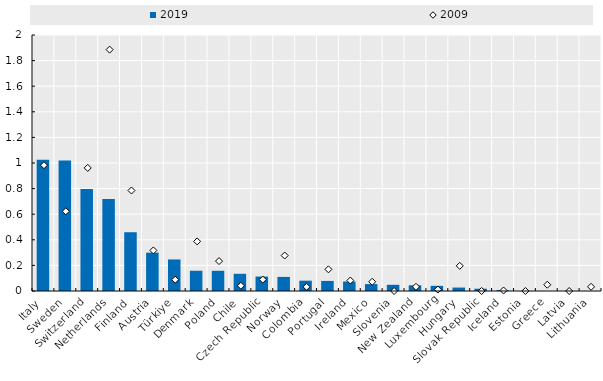
| Category | 2019 |
|---|---|
| Italy | 1.026 |
| Sweden | 1.019 |
| Switzerland | 0.797 |
| Netherlands | 0.719 |
| Finland | 0.459 |
| Austria | 0.3 |
| Türkiye | 0.246 |
| Denmark | 0.158 |
| Poland | 0.158 |
| Chile | 0.134 |
| Czech Republic | 0.113 |
| Norway | 0.11 |
| Colombia | 0.081 |
| Portugal | 0.079 |
| Ireland | 0.074 |
| Mexico | 0.054 |
| Slovenia | 0.048 |
| New Zealand | 0.045 |
| Luxembourg | 0.04 |
| Hungary | 0.027 |
| Slovak Republic | 0.018 |
| Iceland | 0.007 |
| Estonia | 0 |
| Greece | 0 |
| Latvia | 0 |
| Lithuania | 0 |